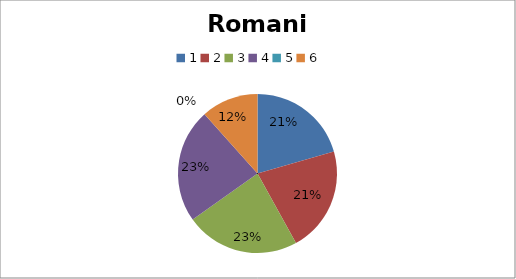
| Category | Romania |
|---|---|
| 0 | 23 |
| 1 | 24 |
| 2 | 26 |
| 3 | 26 |
| 4 | 0 |
| 5 | 13 |